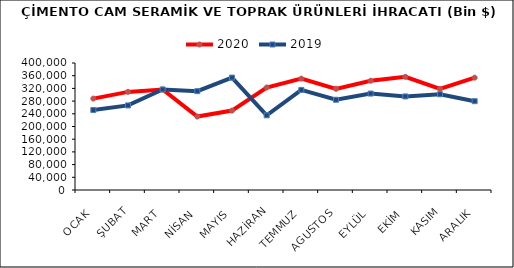
| Category | 2020 | 2019 |
|---|---|---|
| OCAK | 287897.459 | 251902.829 |
| ŞUBAT | 309024.147 | 266361.495 |
| MART | 316474.962 | 316697.19 |
| NİSAN | 231358.316 | 311274.737 |
| MAYIS | 250126.455 | 353998.852 |
| HAZİRAN | 322830.289 | 235214.693 |
| TEMMUZ | 350679.749 | 315273.004 |
| AGUSTOS | 318651.008 | 284201.111 |
| EYLÜL | 344068.359 | 303733.656 |
| EKİM | 356460.203 | 294721.39 |
| KASIM | 318339.827 | 301559.381 |
| ARALIK | 353775.954 | 279704.957 |